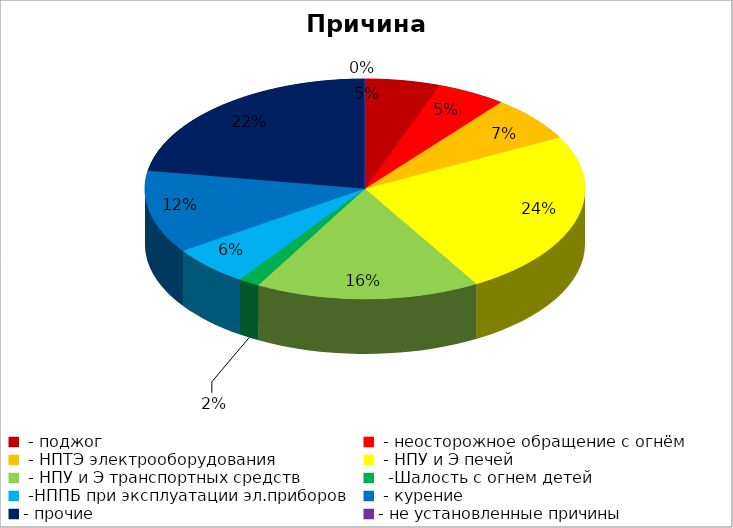
| Category | Причина пожара |
|---|---|
|  - поджог | 14 |
|  - неосторожное обращение с огнём | 13 |
|  - НПТЭ электрооборудования | 17 |
|  - НПУ и Э печей | 62 |
|  - НПУ и Э транспортных средств | 42 |
|   -Шалость с огнем детей | 4 |
|  -НППБ при эксплуатации эл.приборов | 15 |
|  - курение | 31 |
| - прочие | 57 |
| - не установленные причины | 0 |